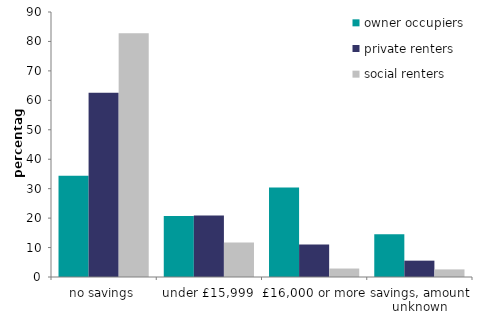
| Category | owner occupiers | private renters | social renters |
|---|---|---|---|
| no savings | 34.345 | 62.569 | 82.797 |
| under £15,999 | 20.743 | 20.85 | 11.741 |
| £16,000 or more | 30.37 | 11.029 | 2.878 |
| savings, amount unknown | 14.542 | 5.551 | 2.584 |